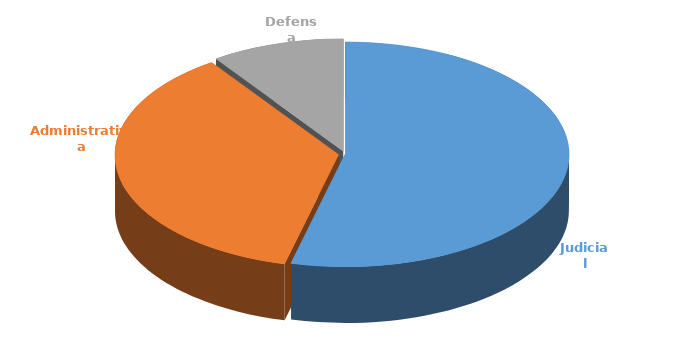
| Category | Cantidad |
|---|---|
| Judicial | 347 |
| Administrativa | 235 |
| Defensa | 62 |